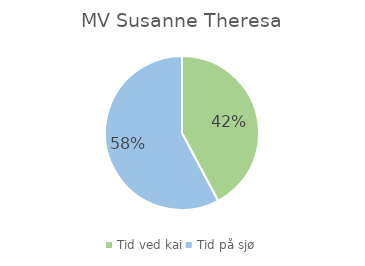
| Category | Series 0 |
|---|---|
| Tid ved kai | 0.422 |
| Tid på sjø | 0.578 |